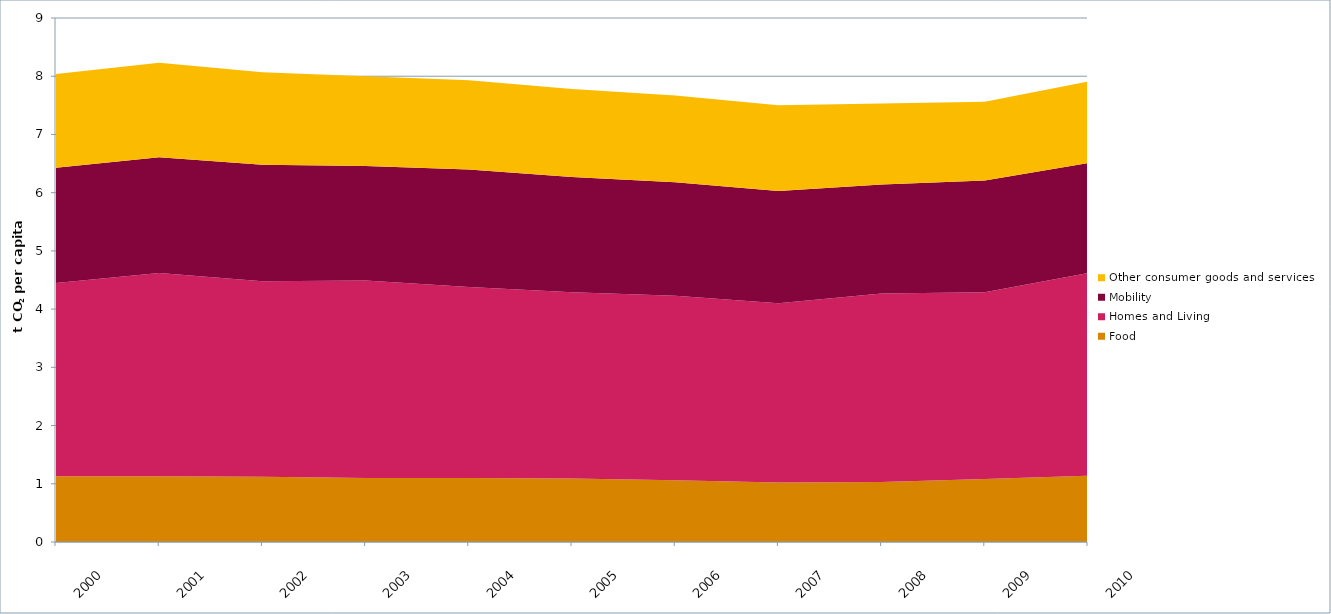
| Category | Food | Homes and Living | Mobility | Other consumer goods and services |
|---|---|---|---|---|
| 2000.0 | 1.13 | 3.32 | 1.98 | 1.61 |
| 2001.0 | 1.13 | 3.49 | 1.99 | 1.62 |
| 2002.0 | 1.12 | 3.36 | 2 | 1.59 |
| 2003.0 | 1.1 | 3.39 | 1.97 | 1.54 |
| 2004.0 | 1.1 | 3.28 | 2.02 | 1.53 |
| 2005.0 | 1.09 | 3.2 | 1.98 | 1.51 |
| 2006.0 | 1.06 | 3.17 | 1.95 | 1.49 |
| 2007.0 | 1.02 | 3.08 | 1.93 | 1.47 |
| 2008.0 | 1.03 | 3.24 | 1.87 | 1.39 |
| 2009.0 | 1.08 | 3.21 | 1.92 | 1.35 |
| 2010.0 | 1.14 | 3.48 | 1.89 | 1.4 |